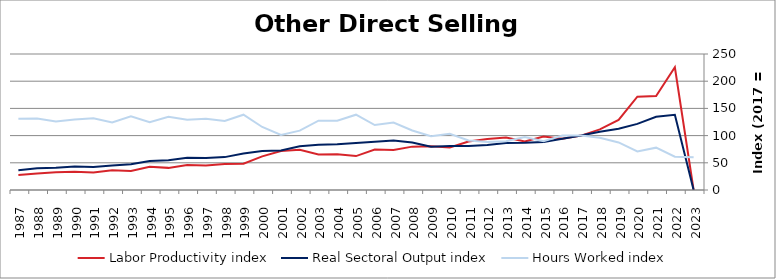
| Category | Labor Productivity index | Real Sectoral Output index | Hours Worked index |
|---|---|---|---|
| 2023.0 | 0 | 0 | 60.005 |
| 2022.0 | 225.641 | 138.199 | 61.247 |
| 2021.0 | 172.862 | 134.585 | 77.857 |
| 2020.0 | 171.606 | 121.586 | 70.852 |
| 2019.0 | 128.907 | 112.681 | 87.413 |
| 2018.0 | 111.369 | 107.081 | 96.15 |
| 2017.0 | 100 | 100 | 100 |
| 2016.0 | 94.161 | 94.391 | 100.244 |
| 2015.0 | 98.391 | 88.368 | 89.814 |
| 2014.0 | 89.083 | 86.84 | 97.482 |
| 2013.0 | 96.622 | 86.466 | 89.489 |
| 2012.0 | 93.947 | 82.825 | 88.161 |
| 2011.0 | 88.966 | 81.053 | 91.105 |
| 2010.0 | 78.184 | 80.893 | 103.465 |
| 2009.0 | 80.409 | 79.535 | 98.913 |
| 2008.0 | 79.714 | 87.184 | 109.372 |
| 2007.0 | 73.559 | 91.106 | 123.855 |
| 2006.0 | 74.394 | 88.855 | 119.44 |
| 2005.0 | 62.354 | 86.305 | 138.411 |
| 2004.0 | 65.921 | 84.005 | 127.433 |
| 2003.0 | 65.313 | 83.274 | 127.5 |
| 2002.0 | 73.811 | 80.492 | 109.05 |
| 2001.0 | 71.766 | 72.693 | 101.291 |
| 2000.0 | 61.864 | 71.681 | 115.868 |
| 1999.0 | 48.403 | 66.982 | 138.384 |
| 1998.0 | 47.643 | 60.454 | 126.89 |
| 1997.0 | 44.94 | 58.955 | 131.184 |
| 1996.0 | 46.109 | 59.491 | 129.022 |
| 1995.0 | 40.677 | 54.695 | 134.462 |
| 1994.0 | 42.788 | 53.303 | 124.575 |
| 1993.0 | 34.849 | 47.212 | 135.476 |
| 1992.0 | 36.153 | 44.95 | 124.331 |
| 1991.0 | 32.158 | 42.397 | 131.84 |
| 1990.0 | 33.432 | 43.255 | 129.381 |
| 1989.0 | 32.409 | 40.848 | 126.04 |
| 1988.0 | 30.382 | 39.979 | 131.588 |
| 1987.0 | 27.646 | 36.205 | 130.961 |